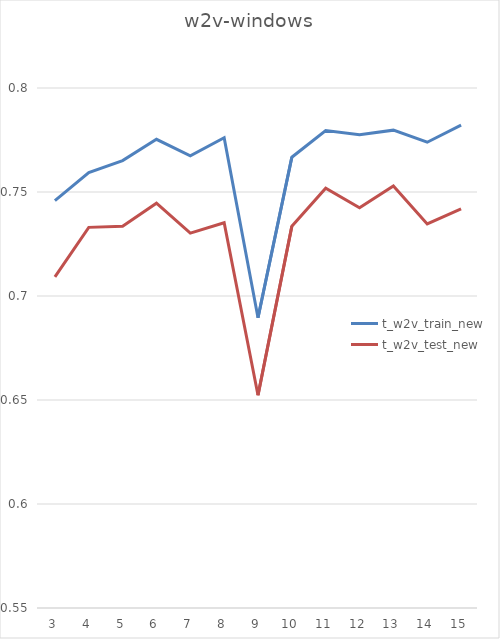
| Category | t_w2v_train_new | t_w2v_test_new |
|---|---|---|
| 3.0 | 0.746 | 0.709 |
| 4.0 | 0.759 | 0.733 |
| 5.0 | 0.765 | 0.734 |
| 6.0 | 0.775 | 0.745 |
| 7.0 | 0.767 | 0.73 |
| 8.0 | 0.776 | 0.735 |
| 9.0 | 0.69 | 0.652 |
| 10.0 | 0.767 | 0.734 |
| 11.0 | 0.78 | 0.752 |
| 12.0 | 0.777 | 0.742 |
| 13.0 | 0.78 | 0.753 |
| 14.0 | 0.774 | 0.735 |
| 15.0 | 0.782 | 0.742 |